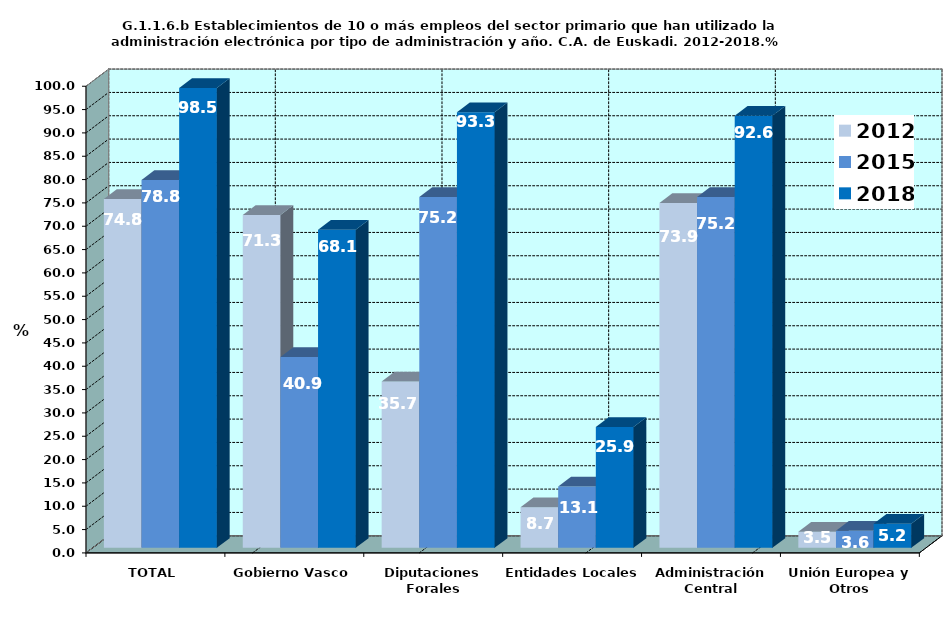
| Category | 2012 | 2015 | 2018 |
|---|---|---|---|
| TOTAL | 74.783 | 78.832 | 98.519 |
| Gobierno Vasco | 71.304 | 40.876 | 68.148 |
| Diputaciones Forales | 35.652 | 75.182 | 93.333 |
| Entidades Locales | 8.696 | 13.139 | 25.926 |
| Administración Central | 73.913 | 75.182 | 92.593 |
| Unión Europea y Otros | 3.478 | 3.65 | 5.185 |